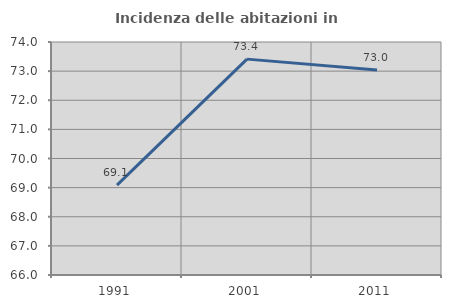
| Category | Incidenza delle abitazioni in proprietà  |
|---|---|
| 1991.0 | 69.085 |
| 2001.0 | 73.412 |
| 2011.0 | 73.041 |